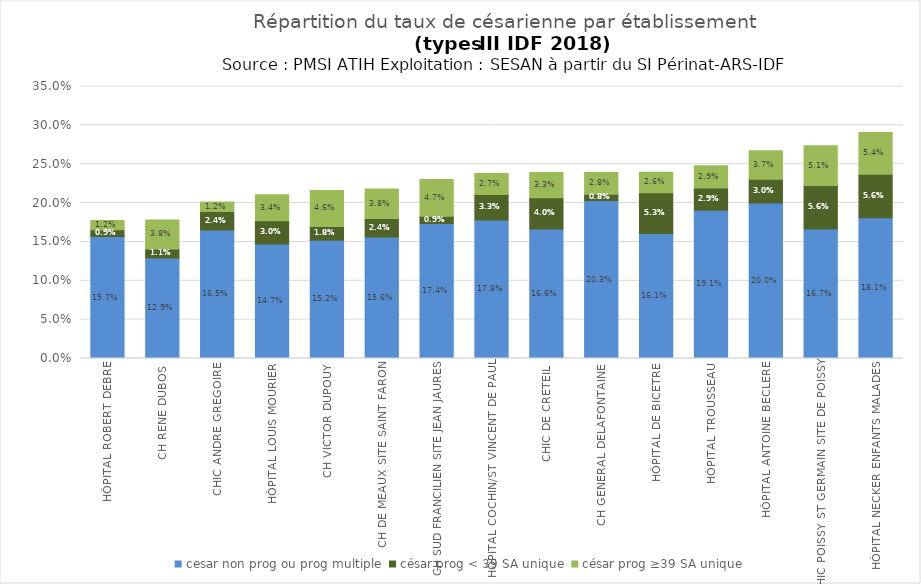
| Category | cesar non prog ou prog multiple | césar prog < 39 SA unique | césar prog ≥39 SA unique |
|---|---|---|---|
| HÔPITAL ROBERT DEBRE | 0.157 | 0.009 | 0.012 |
| CH RENE DUBOS | 0.129 | 0.011 | 0.038 |
| CHIC ANDRE GREGOIRE | 0.165 | 0.024 | 0.012 |
| HÔPITAL LOUIS MOURIER | 0.147 | 0.03 | 0.034 |
| CH VICTOR DUPOUY | 0.152 | 0.018 | 0.046 |
| CH DE MEAUX SITE SAINT FARON | 0.156 | 0.024 | 0.038 |
| CH SUD FRANCILIEN SITE JEAN JAURES | 0.174 | 0.009 | 0.047 |
| HÔPITAL COCHIN/ST VINCENT DE PAUL | 0.178 | 0.033 | 0.027 |
| CHIC DE CRETEIL | 0.166 | 0.04 | 0.033 |
| CH GENERAL DELAFONTAINE | 0.203 | 0.008 | 0.028 |
| HÔPITAL DE BICETRE | 0.161 | 0.053 | 0.026 |
| HÔPITAL TROUSSEAU | 0.191 | 0.029 | 0.029 |
| HÔPITAL ANTOINE BECLERE | 0.2 | 0.03 | 0.037 |
| CHIC POISSY ST GERMAIN SITE DE POISSY | 0.167 | 0.056 | 0.051 |
| HÔPITAL NECKER ENFANTS MALADES | 0.181 | 0.056 | 0.054 |